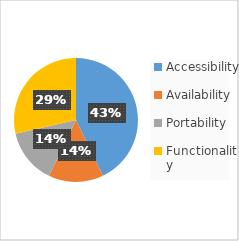
| Category | Series 0 |
|---|---|
| Accessibility | 3 |
| Availability | 1 |
| Portability | 1 |
| Functionality | 2 |